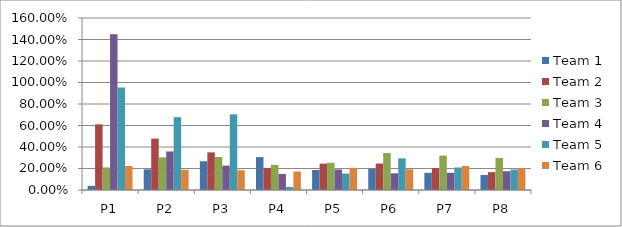
| Category | Team 1 | Team 2 | Team 3 | Team 4 | Team 5 | Team 6 |
|---|---|---|---|---|---|---|
| P1 | 0.039 | 0.611 | 0.21 | 1.45 | 0.954 | 0.223 |
| P2 | 0.192 | 0.478 | 0.304 | 0.358 | 0.678 | 0.188 |
| P3 | 0.267 | 0.35 | 0.307 | 0.227 | 0.704 | 0.184 |
| P4 | 0.306 | 0.206 | 0.234 | 0.15 | 0.028 | 0.172 |
| P5 | 0.186 | 0.245 | 0.253 | 0.191 | 0.153 | 0.206 |
| P6 | 0.198 | 0.246 | 0.344 | 0.155 | 0.295 | 0.193 |
| P7 | 0.16 | 0.204 | 0.32 | 0.16 | 0.209 | 0.223 |
| P8 | 0.139 | 0.166 | 0.298 | 0.175 | 0.19 | 0.203 |